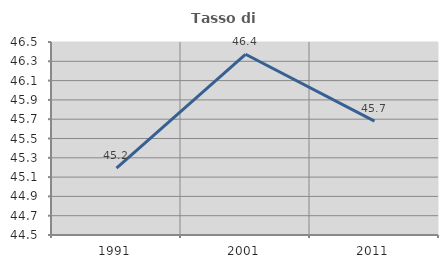
| Category | Tasso di occupazione   |
|---|---|
| 1991.0 | 45.194 |
| 2001.0 | 46.373 |
| 2011.0 | 45.68 |